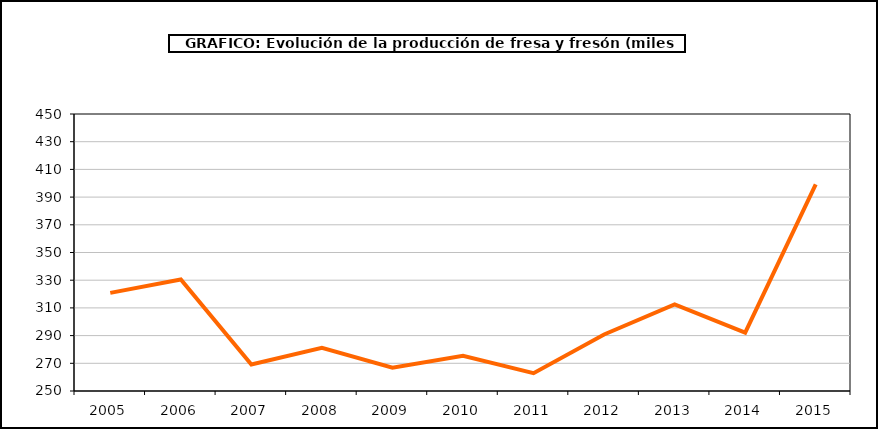
| Category | producción |
|---|---|
| 2005.0 | 320.853 |
| 2006.0 | 330.485 |
| 2007.0 | 269.139 |
| 2008.0 | 281.24 |
| 2009.0 | 266.772 |
| 2010.0 | 275.355 |
| 2011.0 | 262.896 |
| 2012.0 | 290.843 |
| 2013.0 | 312.466 |
| 2014.0 | 292.101 |
| 2015.0 | 399.217 |